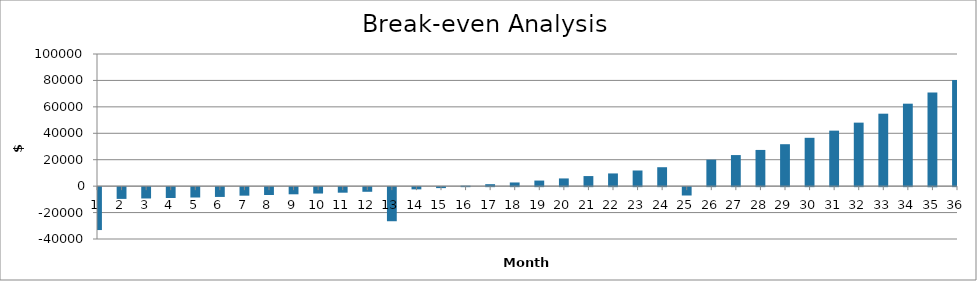
| Category | Net Income |
|---|---|
| 1.0 | -32470.626 |
| 2.0 | -8899.308 |
| 3.0 | -8572.047 |
| 4.0 | -8222.674 |
| 5.0 | -7840.066 |
| 6.0 | -7412.468 |
| 7.0 | -6449.305 |
| 8.0 | -5951.69 |
| 9.0 | -5415.399 |
| 10.0 | -4833.956 |
| 11.0 | -4200.305 |
| 12.0 | -3506.729 |
| 13.0 | -25799.196 |
| 14.0 | -1682.903 |
| 15.0 | -731.557 |
| 16.0 | 321.667 |
| 17.0 | 1489.705 |
| 18.0 | 2786.928 |
| 19.0 | 4229.327 |
| 20.0 | 5834.717 |
| 21.0 | 7622.955 |
| 22.0 | 9616.198 |
| 23.0 | 11839.179 |
| 24.0 | 14319.522 |
| 25.0 | -6329.769 |
| 26.0 | 20038.095 |
| 27.0 | 23514.243 |
| 28.0 | 27397.215 |
| 29.0 | 31735.522 |
| 30.0 | 36583.444 |
| 31.0 | 42001.727 |
| 32.0 | 48058.362 |
| 33.0 | 54829.465 |
| 34.0 | 62400.259 |
| 35.0 | 70866.174 |
| 36.0 | 80334.089 |